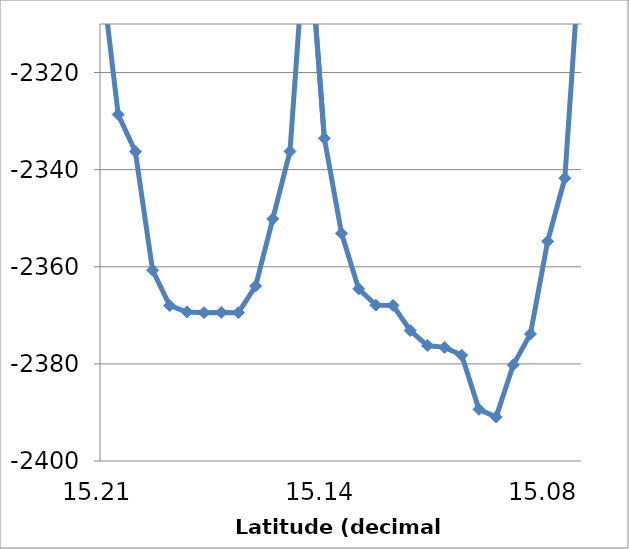
| Category | Series 0 |
|---|---|
| 15.2088 | -2298.59 |
| 15.2037 | -2328.63 |
| 15.1986 | -2336.28 |
| 15.1935 | -2360.69 |
| 15.1885 | -2367.98 |
| 15.1834 | -2369.31 |
| 15.1783 | -2369.45 |
| 15.1732 | -2369.4 |
| 15.1681 | -2369.45 |
| 15.1631 | -2363.96 |
| 15.158 | -2350.14 |
| 15.1529 | -2336.25 |
| 15.1478 | -2286.6 |
| 15.1427 | -2333.53 |
| 15.1377 | -2353.1 |
| 15.1326 | -2364.55 |
| 15.1275 | -2367.9 |
| 15.1224 | -2367.96 |
| 15.1174 | -2373.13 |
| 15.1121 | -2376.22 |
| 15.1069 | -2376.6 |
| 15.1018 | -2378.23 |
| 15.0967 | -2389.36 |
| 15.0915 | -2390.94 |
| 15.0864 | -2380.21 |
| 15.0812 | -2373.84 |
| 15.0761 | -2354.77 |
| 15.071 | -2341.76 |
| 15.0658 | -2289.91 |